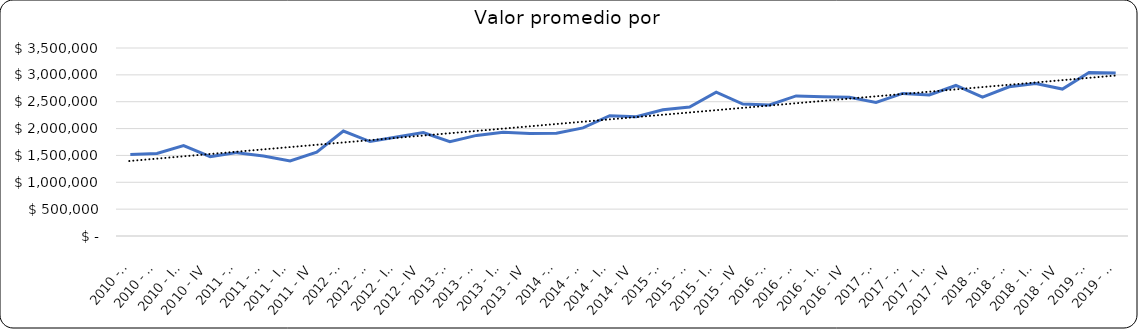
| Category | Valor m2 en Bogotá por sectores |
|---|---|
| 2010 - I | 1518817.204 |
| 2010 - II | 1534946.237 |
| 2010 - III | 1682795.699 |
| 2010 - IV | 1478494.624 |
| 2011 - I | 1551912.568 |
| 2011 - II | 1489071.038 |
| 2011 - III | 1398907.104 |
| 2011 - IV | 1562841.522 |
| 2012 - I | 1954022.989 |
| 2012 - II | 1758620.69 |
| 2012 - III | 1841954.023 |
| 2012 - IV | 1925287.356 |
| 2013 - I | 1756310.594 |
| 2013 - II | 1872727.273 |
| 2013 - III | 1930303.03 |
| 2013 - IV | 1909090.909 |
| 2014 - I | 1913580.247 |
| 2014 - II | 2012345.679 |
| 2014 - III | 2240740.741 |
| 2014 - IV | 2222222.222 |
| 2015 - I | 2349056.604 |
| 2015 - II | 2402515.723 |
| 2015 - III | 2679245.283 |
| 2015 - IV | 2455974.843 |
| 2016 - I | 2440476.19 |
| 2016 - II | 2608024.691 |
| 2016 - III | 2591194.969 |
| 2016 - IV | 2583333.333 |
| 2017 - I | 2487654.321 |
| 2017 - II | 2654320.988 |
| 2017 - III | 2627329.193 |
| 2017 - IV | 2802431.611 |
| 2018 - I | 2586206.897 |
| 2018 - II | 2777777.778 |
| 2018 - III | 2837838 |
| 2018 - IV | 2735849 |
| 2019 - I | 3045455 |
| 2019 - II | 3035714 |